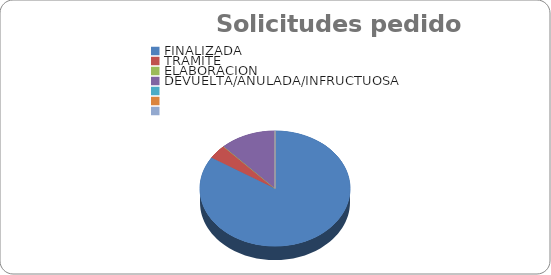
| Category | Series 0 |
|---|---|
| FINALIZADA | 21 |
| TRAMITE | 1 |
| ELABORACION | 0 |
| DEVUELTA/ANULADA/INFRUCTUOSA | 3 |